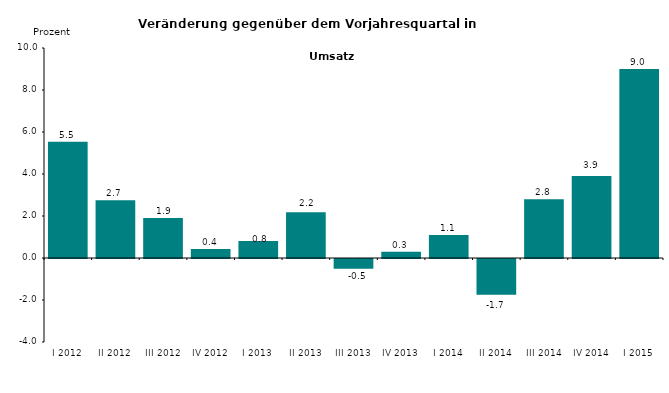
| Category | Series 0 |
|---|---|
| I 2012 | 5.54 |
| II 2012 | 2.745 |
| III 2012 | 1.908 |
| IV 2012 | 0.427 |
| I 2013 | 0.81 |
| II 2013 | 2.181 |
| III 2013 | -0.465 |
| IV 2013 | 0.3 |
| I 2014 | 1.1 |
| II 2014 | -1.7 |
| III 2014 | 2.8 |
| IV 2014 | 3.9 |
| I 2015 | 9 |